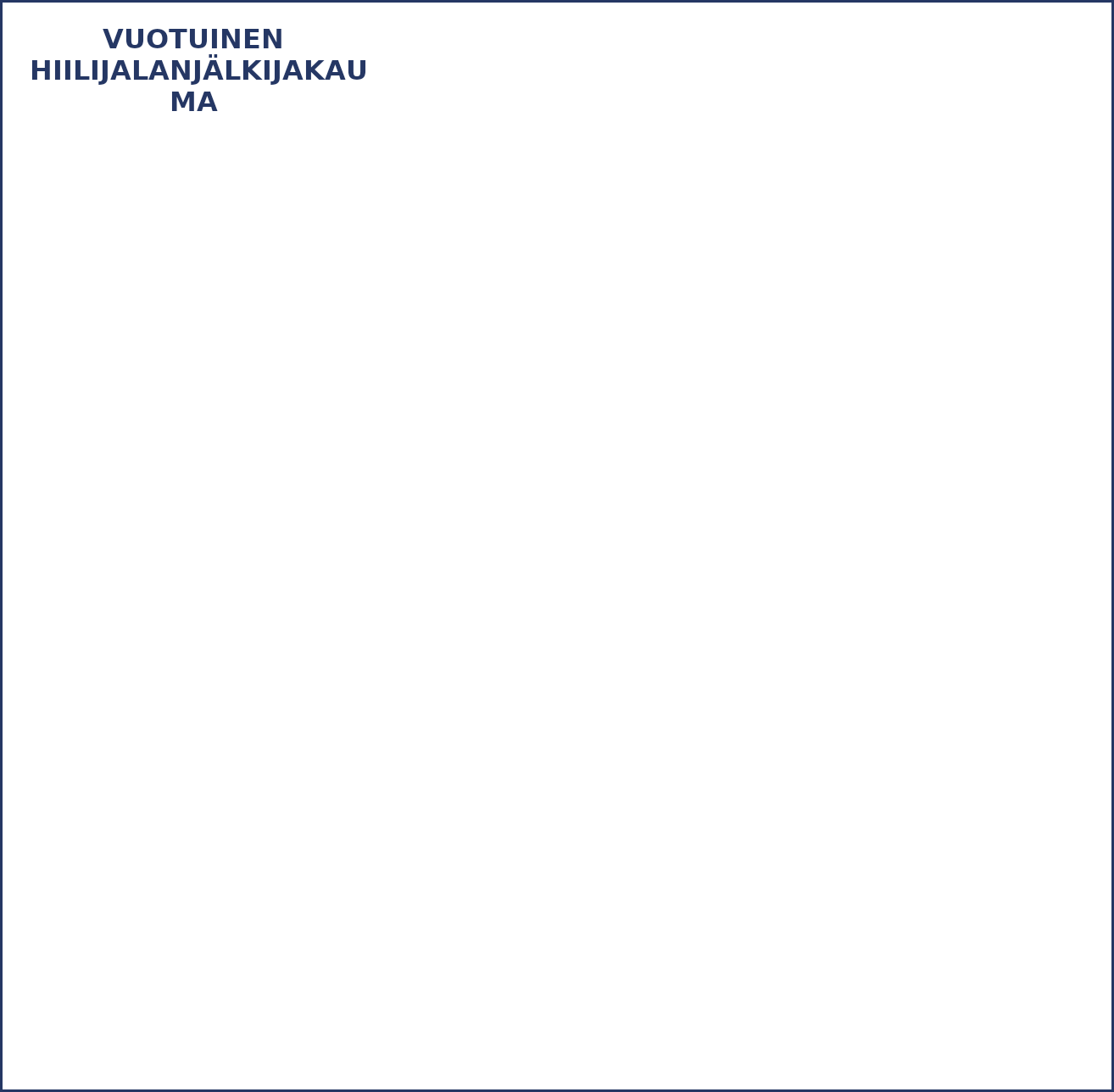
| Category | Series 0 | Series 1 |
|---|---|---|
| Säännöllinen toiminta / viikkotoiminta | 0 |  |
| Jätehuolto | 0 |  |
| Hankinnat | 0 |  |
| Palvelut | 0 |  |
| Poltto | 0 |  |
| Tapahtumat | 0 |  |
| Postitus | 0 |  |
| Energia | 0 |  |
| Lentäminen, yöpyminen ja muut matkat | 0 |  |
| Palkatun henkilöstön työmatkustaminen | 0 |  |
| Organisaation ajoneuvot | 0 |  |